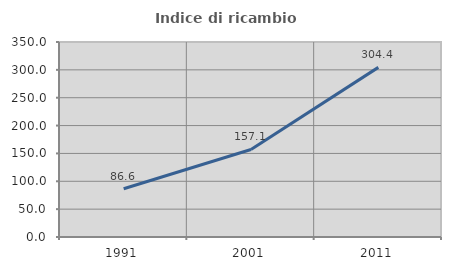
| Category | Indice di ricambio occupazionale  |
|---|---|
| 1991.0 | 86.554 |
| 2001.0 | 157.102 |
| 2011.0 | 304.44 |